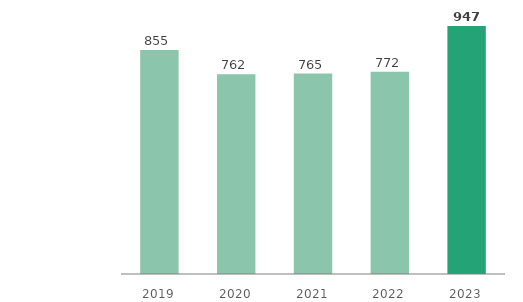
| Category | Assets in Kazakhstan |
|---|---|
| 2019.0 | 855 |
| 2020.0 | 762 |
| 2021.0 | 765 |
| 2022.0 | 772 |
| 2023.0 | 947 |